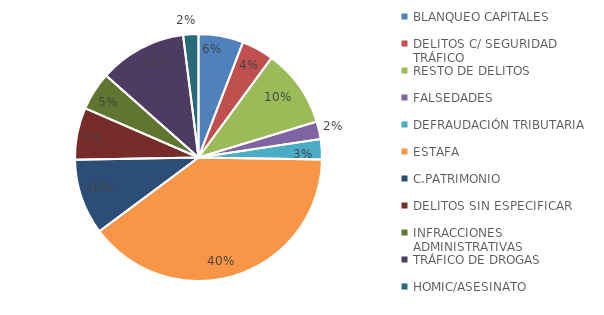
| Category | Nº |
|---|---|
| BLANQUEO CAPITALES | 501 |
| DELITOS C/ SEGURIDAD TRÁFICO | 360 |
| RESTO DE DELITOS | 875 |
| FALSEDADES | 197 |
| DEFRAUDACIÓN TRIBUTARIA | 226 |
| ESTAFA | 3382 |
| C.PATRIMONIO | 845 |
| DELITOS SIN ESPECIFICAR | 583 |
| INFRACCIONES ADMINISTRATIVAS | 430 |
| TRÁFICO DE DROGAS | 979 |
| HOMIC/ASESINATO | 171 |